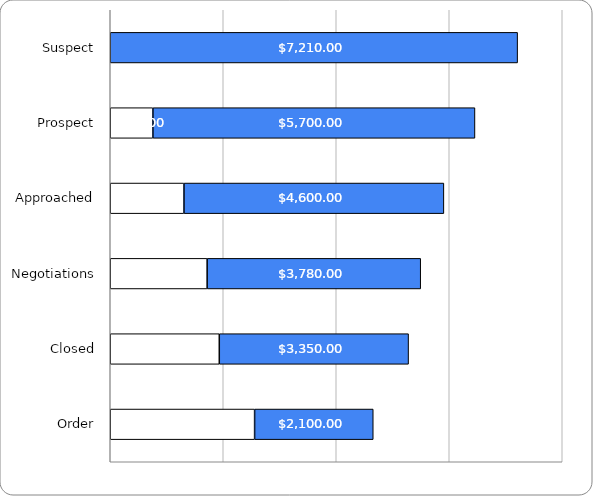
| Category | Series 0 | Series 1 |
|---|---|---|
| Suspect | 0 | 7210 |
| Prospect | 755 | 5700 |
| Approached | 1305 | 4600 |
| Negotiations | 1715 | 3780 |
| Closed | 1930 | 3350 |
| Order | 2555 | 2100 |